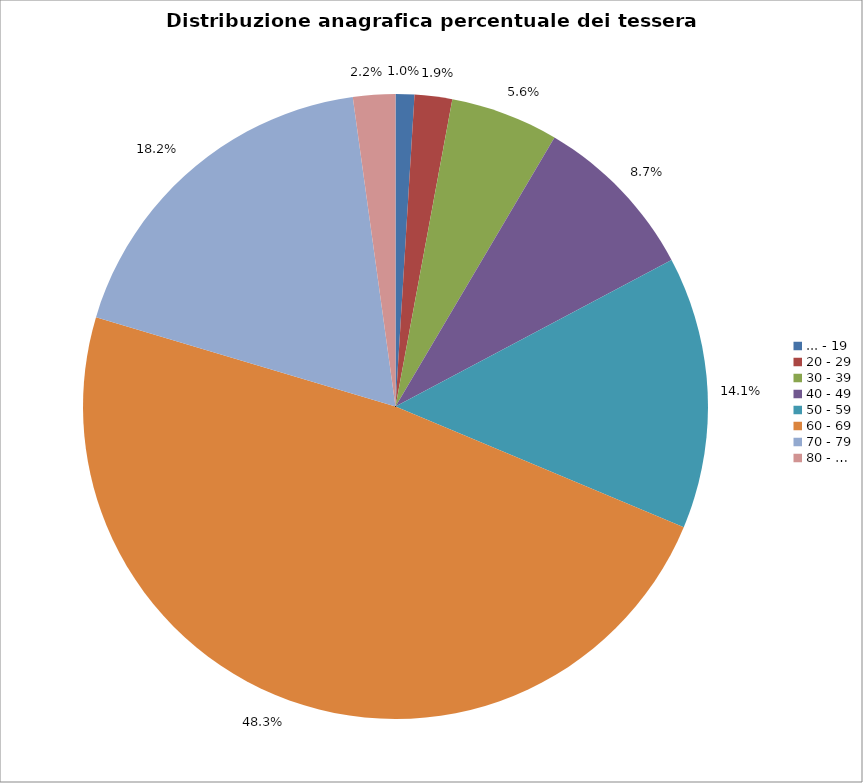
| Category | Nr. Tesserati |
|---|---|
| ... - 19 | 4 |
| 20 - 29 | 8 |
| 30 - 39 | 23 |
| 40 - 49 | 36 |
| 50 - 59 | 58 |
| 60 - 69 | 199 |
| 70 - 79 | 75 |
| 80 - … | 9 |